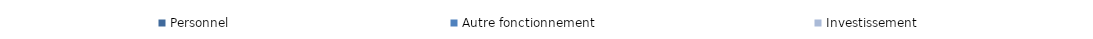
| Category | Personnel | Autre fonctionnement | Investissement |
|---|---|---|---|
| 2015.0 | 9.633 | 5.799 | 3.102 |
| 2016.0 | 9.604 | 5.671 | 2.868 |
| 2017.0 | 9.884 | 5.803 | 3.407 |
| 2018.0 | 9.886 | 5.924 | 3.738 |